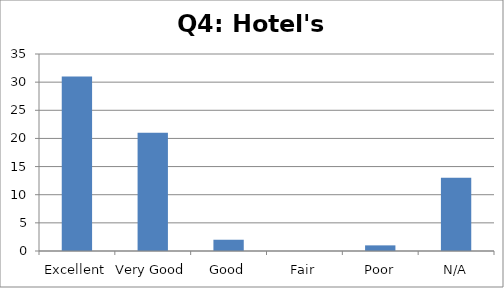
| Category | Response count |
|---|---|
| Excellent | 31 |
| Very Good | 21 |
| Good | 2 |
| Fair | 0 |
| Poor | 1 |
| N/A | 13 |